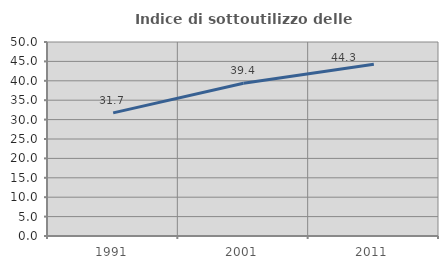
| Category | Indice di sottoutilizzo delle abitazioni  |
|---|---|
| 1991.0 | 31.73 |
| 2001.0 | 39.369 |
| 2011.0 | 44.277 |